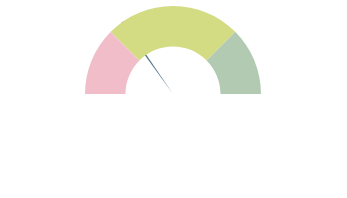
| Category | Series 1 |
|---|---|
| 0 | 0.3 |
| 1 | 0.01 |
| 2 | 1.69 |